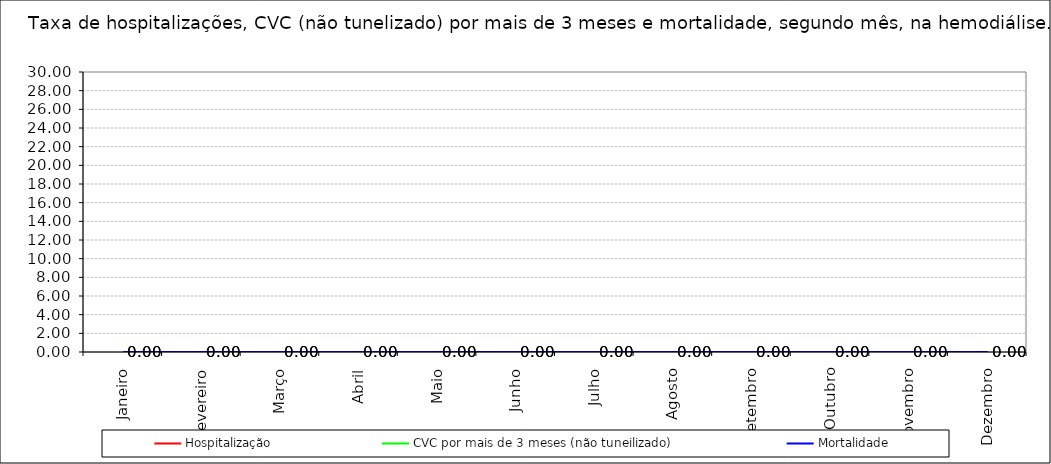
| Category | Hospitalização | CVC por mais de 3 meses (não tuneilizado) | Mortalidade |
|---|---|---|---|
| Janeiro | 0 | 0 | 0 |
| Fevereiro | 0 | 0 | 0 |
| Março | 0 | 0 | 0 |
| Abril | 0 | 0 | 0 |
| Maio | 0 | 0 | 0 |
| Junho | 0 | 0 | 0 |
| Julho | 0 | 0 | 0 |
| Agosto | 0 | 0 | 0 |
| Setembro | 0 | 0 | 0 |
| Outubro | 0 | 0 | 0 |
| Novembro | 0 | 0 | 0 |
| Dezembro | 0 | 0 | 0 |